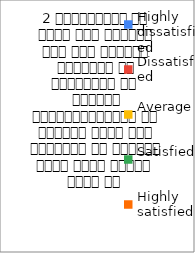
| Category | 2 व्याख्यान से रूचि में वृद्धि हुई एवं शिक्षण जानकारी से परिपूर्ण था 
शिक्षक विद्यार्थियों के द्वारा पूछे गये प्रश्नो का समाधान करने हेतु तत्पर  रहते है  |
|---|---|
| Highly dissatisfied | 4 |
| Dissatisfied | 2 |
| Average | 5 |
| Satisfied | 7 |
| Highly satisfied | 45 |